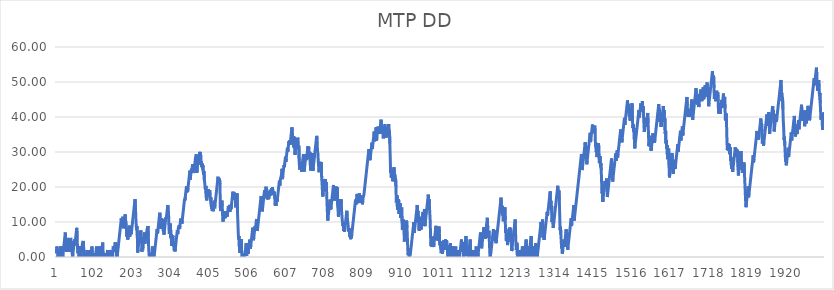
| Category | MTP DD |
|---|---|
| 0 | 1 |
| 1 | 2 |
| 2 | 3 |
| 3 | 1.1 |
| 4 | 2.1 |
| 5 | 0 |
| 6 | 0 |
| 7 | 1 |
| 8 | 0 |
| 9 | 1 |
| 10 | 2 |
| 11 | 3 |
| 12 | 0.94 |
| 13 | 0 |
| 14 | 1 |
| 15 | 2 |
| 16 | 3 |
| 17 | 0 |
| 18 | 1 |
| 19 | 2 |
| 20 | 3 |
| 21 | 4 |
| 22 | 5 |
| 23 | 6 |
| 24 | 7 |
| 25 | 4.6 |
| 26 | 1.46 |
| 27 | 2.46 |
| 28 | 3.46 |
| 29 | 4.46 |
| 30 | 5.46 |
| 31 | 3.83 |
| 32 | 2.4 |
| 33 | 3.4 |
| 34 | 1.46 |
| 35 | 2.46 |
| 36 | 3.46 |
| 37 | 4.46 |
| 38 | 5.46 |
| 39 | 2.52 |
| 40 | 3.52 |
| 41 | 4.52 |
| 42 | 1.09 |
| 43 | 0 |
| 44 | 1 |
| 45 | 2 |
| 46 | 3 |
| 47 | 4 |
| 48 | 5 |
| 49 | 3.33 |
| 50 | 4.33 |
| 51 | 5.33 |
| 52 | 6.33 |
| 53 | 7.33 |
| 54 | 8.33 |
| 55 | 5.44 |
| 56 | 2.7 |
| 57 | 1.05 |
| 58 | 2.05 |
| 59 | 3.05 |
| 60 | 0.11 |
| 61 | 1.11 |
| 62 | 2.11 |
| 63 | 3.11 |
| 64 | 1.72 |
| 65 | 0 |
| 66 | 1 |
| 67 | 2 |
| 68 | 3 |
| 69 | 4 |
| 70 | 3.59 |
| 71 | 4.59 |
| 72 | 2.92 |
| 73 | 0.27 |
| 74 | 0 |
| 75 | 0 |
| 76 | 0 |
| 77 | 1 |
| 78 | 0 |
| 79 | 0 |
| 80 | 1 |
| 81 | 2 |
| 82 | 0 |
| 83 | 0 |
| 84 | 1 |
| 85 | 2 |
| 86 | 0.94 |
| 87 | 0 |
| 88 | 0 |
| 89 | 1 |
| 90 | 0 |
| 91 | 0 |
| 92 | 1 |
| 93 | 2 |
| 94 | 3 |
| 95 | 0.06 |
| 96 | 0 |
| 97 | 0 |
| 98 | 0 |
| 99 | 0 |
| 100 | 1 |
| 101 | 0 |
| 102 | 1 |
| 103 | 0 |
| 104 | 1 |
| 105 | 2 |
| 106 | 3 |
| 107 | 1.33 |
| 108 | 0 |
| 109 | 0 |
| 110 | 1 |
| 111 | 2 |
| 112 | 3 |
| 113 | 0 |
| 114 | 1 |
| 115 | 0 |
| 116 | 1 |
| 117 | 2 |
| 118 | 3 |
| 119 | 1.12 |
| 120 | 2.12 |
| 121 | 3.12 |
| 122 | 4.12 |
| 123 | 0 |
| 124 | 1 |
| 125 | 0 |
| 126 | 0 |
| 127 | 0 |
| 128 | 0 |
| 129 | 0 |
| 130 | 1 |
| 131 | 0 |
| 132 | 1 |
| 133 | 0 |
| 134 | 1 |
| 135 | 2 |
| 136 | 0.31 |
| 137 | 0 |
| 138 | 0 |
| 139 | 1 |
| 140 | 0 |
| 141 | 1 |
| 142 | 2 |
| 143 | 0 |
| 144 | 0 |
| 145 | 1 |
| 146 | 2 |
| 147 | 0 |
| 148 | 1 |
| 149 | 2 |
| 150 | 3 |
| 151 | 1.53 |
| 152 | 2.53 |
| 153 | 2.23 |
| 154 | 3.23 |
| 155 | 4.23 |
| 156 | 3.11 |
| 157 | 2.03 |
| 158 | 0.02 |
| 159 | 1.02 |
| 160 | 0 |
| 161 | 1 |
| 162 | 2 |
| 163 | 3 |
| 164 | 4 |
| 165 | 5 |
| 166 | 6 |
| 167 | 7 |
| 168 | 8 |
| 169 | 9 |
| 170 | 10 |
| 171 | 11 |
| 172 | 8.5 |
| 173 | 9.5 |
| 174 | 10.5 |
| 175 | 11.5 |
| 176 | 9.34 |
| 177 | 8.18 |
| 178 | 9.18 |
| 179 | 10.18 |
| 180 | 11.18 |
| 181 | 12.18 |
| 182 | 10.55 |
| 183 | 10.25 |
| 184 | 9.28 |
| 185 | 5.85 |
| 186 | 6.85 |
| 187 | 5.77 |
| 188 | 4.97 |
| 189 | 5.97 |
| 190 | 6.97 |
| 191 | 7.97 |
| 192 | 8.97 |
| 193 | 5.83 |
| 194 | 6.83 |
| 195 | 7.83 |
| 196 | 8.83 |
| 197 | 6.53 |
| 198 | 7.53 |
| 199 | 8.53 |
| 200 | 9.53 |
| 201 | 10.53 |
| 202 | 11.53 |
| 203 | 12.53 |
| 204 | 13.53 |
| 205 | 14.53 |
| 206 | 15.53 |
| 207 | 16.53 |
| 208 | 14.57 |
| 209 | 11.34 |
| 210 | 9.23 |
| 211 | 7.8 |
| 212 | 8.8 |
| 213 | 6.15 |
| 214 | 1.25 |
| 215 | 2.25 |
| 216 | 3.25 |
| 217 | 4.25 |
| 218 | 5.25 |
| 219 | 4.6 |
| 220 | 5.6 |
| 221 | 6.6 |
| 222 | 7.6 |
| 223 | 6.99 |
| 224 | 4.93 |
| 225 | 1.5 |
| 226 | 2.5 |
| 227 | 2 |
| 228 | 3 |
| 229 | 4 |
| 230 | 5 |
| 231 | 6 |
| 232 | 7 |
| 233 | 3.86 |
| 234 | 4.86 |
| 235 | 5.86 |
| 236 | 6.86 |
| 237 | 6.2 |
| 238 | 7.2 |
| 239 | 8.2 |
| 240 | 7.85 |
| 241 | 8.85 |
| 242 | 5.32 |
| 243 | 2.09 |
| 244 | 0.62 |
| 245 | 0 |
| 246 | 1 |
| 247 | 0 |
| 248 | 0 |
| 249 | 1 |
| 250 | 0 |
| 251 | 1 |
| 252 | 2 |
| 253 | 3 |
| 254 | 0 |
| 255 | 1 |
| 256 | 0 |
| 257 | 0 |
| 258 | 1 |
| 259 | 2 |
| 260 | 3 |
| 261 | 4 |
| 262 | 5 |
| 263 | 6 |
| 264 | 7 |
| 265 | 8 |
| 266 | 6.65 |
| 267 | 7.65 |
| 268 | 8.65 |
| 269 | 9.65 |
| 270 | 10.65 |
| 271 | 11.65 |
| 272 | 12.65 |
| 273 | 11.49 |
| 274 | 8.06 |
| 275 | 9.06 |
| 276 | 10.06 |
| 277 | 11.06 |
| 278 | 8.81 |
| 279 | 9.81 |
| 280 | 10.81 |
| 281 | 7.58 |
| 282 | 7.22 |
| 283 | 6.38 |
| 284 | 7.38 |
| 285 | 8.38 |
| 286 | 9.38 |
| 287 | 10.38 |
| 288 | 11.38 |
| 289 | 10.86 |
| 290 | 11.86 |
| 291 | 12.86 |
| 292 | 13.86 |
| 293 | 14.86 |
| 294 | 13.66 |
| 295 | 12.74 |
| 296 | 8.53 |
| 297 | 6.57 |
| 298 | 7.57 |
| 299 | 8.57 |
| 300 | 9.57 |
| 301 | 5.55 |
| 302 | 6.55 |
| 303 | 3.12 |
| 304 | 4.12 |
| 305 | 5.12 |
| 306 | 6.12 |
| 307 | 5.62 |
| 308 | 3.88 |
| 309 | 2.88 |
| 310 | 1.9 |
| 311 | 2.9 |
| 312 | 1.61 |
| 313 | 2.61 |
| 314 | 3.61 |
| 315 | 4.61 |
| 316 | 5.61 |
| 317 | 6.61 |
| 318 | 7.61 |
| 319 | 6.55 |
| 320 | 7.55 |
| 321 | 8.55 |
| 322 | 8.07 |
| 323 | 9.07 |
| 324 | 7.99 |
| 325 | 8.99 |
| 326 | 9.99 |
| 327 | 10.99 |
| 328 | 9.72 |
| 329 | 10.72 |
| 330 | 9.56 |
| 331 | 10.56 |
| 332 | 11.56 |
| 333 | 12.56 |
| 334 | 13.56 |
| 335 | 14.56 |
| 336 | 15.56 |
| 337 | 16.56 |
| 338 | 16.18 |
| 339 | 17.18 |
| 340 | 18.18 |
| 341 | 19.18 |
| 342 | 20.18 |
| 343 | 18.46 |
| 344 | 19.46 |
| 345 | 18.67 |
| 346 | 19.67 |
| 347 | 20.67 |
| 348 | 21.67 |
| 349 | 22.67 |
| 350 | 23.67 |
| 351 | 24.67 |
| 352 | 22.12 |
| 353 | 23.12 |
| 354 | 24.12 |
| 355 | 25.12 |
| 356 | 24.49 |
| 357 | 25.49 |
| 358 | 26.49 |
| 359 | 23.99 |
| 360 | 24.99 |
| 361 | 25.99 |
| 362 | 24.64 |
| 363 | 25.64 |
| 364 | 26.64 |
| 365 | 27.64 |
| 366 | 28.64 |
| 367 | 28.3 |
| 368 | 29.3 |
| 369 | 24.01 |
| 370 | 25.01 |
| 371 | 26.01 |
| 372 | 27.01 |
| 373 | 28.01 |
| 374 | 27.05 |
| 375 | 28.05 |
| 376 | 29.05 |
| 377 | 30.05 |
| 378 | 28.95 |
| 379 | 29.95 |
| 380 | 26.32 |
| 381 | 27.32 |
| 382 | 25.77 |
| 383 | 26.77 |
| 384 | 25.26 |
| 385 | 26.26 |
| 386 | 24.44 |
| 387 | 23.49 |
| 388 | 24.49 |
| 389 | 22.09 |
| 390 | 21.35 |
| 391 | 19.61 |
| 392 | 19.31 |
| 393 | 20.31 |
| 394 | 17.08 |
| 395 | 16.17 |
| 396 | 17.17 |
| 397 | 18.17 |
| 398 | 19.17 |
| 399 | 18.42 |
| 400 | 19.42 |
| 401 | 17.12 |
| 402 | 18.12 |
| 403 | 19.12 |
| 404 | 17.65 |
| 405 | 16.06 |
| 406 | 17.06 |
| 407 | 14.76 |
| 408 | 13.78 |
| 409 | 14.78 |
| 410 | 13.17 |
| 411 | 14.17 |
| 412 | 13.09 |
| 413 | 14.09 |
| 414 | 15.09 |
| 415 | 16.09 |
| 416 | 13.93 |
| 417 | 14.93 |
| 418 | 15.93 |
| 419 | 16.93 |
| 420 | 17.93 |
| 421 | 18.93 |
| 422 | 19.93 |
| 423 | 20.93 |
| 424 | 21.93 |
| 425 | 22.93 |
| 426 | 21.58 |
| 427 | 22.58 |
| 428 | 21.15 |
| 429 | 22.15 |
| 430 | 20.74 |
| 431 | 14.08 |
| 432 | 13.11 |
| 433 | 14.11 |
| 434 | 15.11 |
| 435 | 16.11 |
| 436 | 14.58 |
| 437 | 11.74 |
| 438 | 10.11 |
| 439 | 11.11 |
| 440 | 12.11 |
| 441 | 11.07 |
| 442 | 12.07 |
| 443 | 13.07 |
| 444 | 11.11 |
| 445 | 12.11 |
| 446 | 13.11 |
| 447 | 11.5 |
| 448 | 12.5 |
| 449 | 11.57 |
| 450 | 12.57 |
| 451 | 13.57 |
| 452 | 14.57 |
| 453 | 12.88 |
| 454 | 13.88 |
| 455 | 14.88 |
| 456 | 12.92 |
| 457 | 13.92 |
| 458 | 14.92 |
| 459 | 13.67 |
| 460 | 14.67 |
| 461 | 15.67 |
| 462 | 16.67 |
| 463 | 17.67 |
| 464 | 18.67 |
| 465 | 16.51 |
| 466 | 17.51 |
| 467 | 18.51 |
| 468 | 16.31 |
| 469 | 17.31 |
| 470 | 18.31 |
| 471 | 14.19 |
| 472 | 15.19 |
| 473 | 16.19 |
| 474 | 17.19 |
| 475 | 18.19 |
| 476 | 12.9 |
| 477 | 10.01 |
| 478 | 6.78 |
| 479 | 5.02 |
| 480 | 6.02 |
| 481 | 2.88 |
| 482 | 1.16 |
| 483 | 2.16 |
| 484 | 3.16 |
| 485 | 4.16 |
| 486 | 5.16 |
| 487 | 1.34 |
| 488 | 0 |
| 489 | 0 |
| 490 | 1 |
| 491 | 0 |
| 492 | 1 |
| 493 | 0 |
| 494 | 0 |
| 495 | 0 |
| 496 | 1 |
| 497 | 2 |
| 498 | 3 |
| 499 | 4 |
| 500 | 0.37 |
| 501 | 1.37 |
| 502 | 2.37 |
| 503 | 3.37 |
| 504 | 0.97 |
| 505 | 1.97 |
| 506 | 2.97 |
| 507 | 3.97 |
| 508 | 4.97 |
| 509 | 3.05 |
| 510 | 2.38 |
| 511 | 3.38 |
| 512 | 4.38 |
| 513 | 5.38 |
| 514 | 6.38 |
| 515 | 7.38 |
| 516 | 8.38 |
| 517 | 7.28 |
| 518 | 4.78 |
| 519 | 5.78 |
| 520 | 6.78 |
| 521 | 7.78 |
| 522 | 8.78 |
| 523 | 7.87 |
| 524 | 8.87 |
| 525 | 9.87 |
| 526 | 10.87 |
| 527 | 10.12 |
| 528 | 7.43 |
| 529 | 8.43 |
| 530 | 9.43 |
| 531 | 10.43 |
| 532 | 11.43 |
| 533 | 12.43 |
| 534 | 13.43 |
| 535 | 14.43 |
| 536 | 15.43 |
| 537 | 16.43 |
| 538 | 17.43 |
| 539 | 16.54 |
| 540 | 13.94 |
| 541 | 13.03 |
| 542 | 14.03 |
| 543 | 15.03 |
| 544 | 16.03 |
| 545 | 17.03 |
| 546 | 18.03 |
| 547 | 19.03 |
| 548 | 17.09 |
| 549 | 18.09 |
| 550 | 19.09 |
| 551 | 20.09 |
| 552 | 18.27 |
| 553 | 19.27 |
| 554 | 16.53 |
| 555 | 17.53 |
| 556 | 16.49 |
| 557 | 17.49 |
| 558 | 16.68 |
| 559 | 17.68 |
| 560 | 18.68 |
| 561 | 17.45 |
| 562 | 18.45 |
| 563 | 18.25 |
| 564 | 19.25 |
| 565 | 18.65 |
| 566 | 19.65 |
| 567 | 18.99 |
| 568 | 19.99 |
| 569 | 17.69 |
| 570 | 18.69 |
| 571 | 18.49 |
| 572 | 17.65 |
| 573 | 18.65 |
| 574 | 16.83 |
| 575 | 14.72 |
| 576 | 15.72 |
| 577 | 14.62 |
| 578 | 15.62 |
| 579 | 16.62 |
| 580 | 15.82 |
| 581 | 16.82 |
| 582 | 17.82 |
| 583 | 18.82 |
| 584 | 19.82 |
| 585 | 20.82 |
| 586 | 21.82 |
| 587 | 20.43 |
| 588 | 21.43 |
| 589 | 22.43 |
| 590 | 22.19 |
| 591 | 23.19 |
| 592 | 24.19 |
| 593 | 25.19 |
| 594 | 22.25 |
| 595 | 23.25 |
| 596 | 24.25 |
| 597 | 25.25 |
| 598 | 26.25 |
| 599 | 25.66 |
| 600 | 26.66 |
| 601 | 27.66 |
| 602 | 28.66 |
| 603 | 27.21 |
| 604 | 28.21 |
| 605 | 29.21 |
| 606 | 30.21 |
| 607 | 31.21 |
| 608 | 30.09 |
| 609 | 31.09 |
| 610 | 32.09 |
| 611 | 33.09 |
| 612 | 32.34 |
| 613 | 33.34 |
| 614 | 32.05 |
| 615 | 33.05 |
| 616 | 34.05 |
| 617 | 35.05 |
| 618 | 36.05 |
| 619 | 37.05 |
| 620 | 35.82 |
| 621 | 33.57 |
| 622 | 34.57 |
| 623 | 31.34 |
| 624 | 32.34 |
| 625 | 33.34 |
| 626 | 34.34 |
| 627 | 29.24 |
| 628 | 30.24 |
| 629 | 31.24 |
| 630 | 32.24 |
| 631 | 33.24 |
| 632 | 32.08 |
| 633 | 33.08 |
| 634 | 34.08 |
| 635 | 33.69 |
| 636 | 30.8 |
| 637 | 31.8 |
| 638 | 27.49 |
| 639 | 24.99 |
| 640 | 25.99 |
| 641 | 25.22 |
| 642 | 26.22 |
| 643 | 27.22 |
| 644 | 24.33 |
| 645 | 25.33 |
| 646 | 26.33 |
| 647 | 27.33 |
| 648 | 28.33 |
| 649 | 29.33 |
| 650 | 25.9 |
| 651 | 24.41 |
| 652 | 25.41 |
| 653 | 26.41 |
| 654 | 27.41 |
| 655 | 28.41 |
| 656 | 29.41 |
| 657 | 27.69 |
| 658 | 28.69 |
| 659 | 29.69 |
| 660 | 30.69 |
| 661 | 31.69 |
| 662 | 30.38 |
| 663 | 31.38 |
| 664 | 28.05 |
| 665 | 29.05 |
| 666 | 30.05 |
| 667 | 26.82 |
| 668 | 24.71 |
| 669 | 25.71 |
| 670 | 26.71 |
| 671 | 27.71 |
| 672 | 28.71 |
| 673 | 29.71 |
| 674 | 24.61 |
| 675 | 25.61 |
| 676 | 26.61 |
| 677 | 27.61 |
| 678 | 28.61 |
| 679 | 29.61 |
| 680 | 30.61 |
| 681 | 31.61 |
| 682 | 32.61 |
| 683 | 33.61 |
| 684 | 34.61 |
| 685 | 33.43 |
| 686 | 30.29 |
| 687 | 29.78 |
| 688 | 27.48 |
| 689 | 25.99 |
| 690 | 24.21 |
| 691 | 25.21 |
| 692 | 26.21 |
| 693 | 27.21 |
| 694 | 25.1 |
| 695 | 26.1 |
| 696 | 27.1 |
| 697 | 22.69 |
| 698 | 21.1 |
| 699 | 18.9 |
| 700 | 17.27 |
| 701 | 18.27 |
| 702 | 19.27 |
| 703 | 20.27 |
| 704 | 21.27 |
| 705 | 22.27 |
| 706 | 21.29 |
| 707 | 22.29 |
| 708 | 20.33 |
| 709 | 21.33 |
| 710 | 18.64 |
| 711 | 15.5 |
| 712 | 12.9 |
| 713 | 10.4 |
| 714 | 11.4 |
| 715 | 12.4 |
| 716 | 13.4 |
| 717 | 14.4 |
| 718 | 15.4 |
| 719 | 16.4 |
| 720 | 14.89 |
| 721 | 13.58 |
| 722 | 14.58 |
| 723 | 15.58 |
| 724 | 16.58 |
| 725 | 17.58 |
| 726 | 18.58 |
| 727 | 19.58 |
| 728 | 20.58 |
| 729 | 17.54 |
| 730 | 18.54 |
| 731 | 16.14 |
| 732 | 17.14 |
| 733 | 18.14 |
| 734 | 19.14 |
| 735 | 20.14 |
| 736 | 17.94 |
| 737 | 18.94 |
| 738 | 19.94 |
| 739 | 14.65 |
| 740 | 13.42 |
| 741 | 11.5 |
| 742 | 12.5 |
| 743 | 13.5 |
| 744 | 14.5 |
| 745 | 15.5 |
| 746 | 16.5 |
| 747 | 15.46 |
| 748 | 16.46 |
| 749 | 13.57 |
| 750 | 12.08 |
| 751 | 10.55 |
| 752 | 10.28 |
| 753 | 8.81 |
| 754 | 9.81 |
| 755 | 7.41 |
| 756 | 8.41 |
| 757 | 7.21 |
| 758 | 8.21 |
| 759 | 9.21 |
| 760 | 10.21 |
| 761 | 11.21 |
| 762 | 12.21 |
| 763 | 13.21 |
| 764 | 11.82 |
| 765 | 10.47 |
| 766 | 9.6 |
| 767 | 8.29 |
| 768 | 7.27 |
| 769 | 8.27 |
| 770 | 7.21 |
| 771 | 5.66 |
| 772 | 6.66 |
| 773 | 5.09 |
| 774 | 6.09 |
| 775 | 5.38 |
| 776 | 6.38 |
| 777 | 7.38 |
| 778 | 8.38 |
| 779 | 9.38 |
| 780 | 10.38 |
| 781 | 11.38 |
| 782 | 12.38 |
| 783 | 13.38 |
| 784 | 14.38 |
| 785 | 15.38 |
| 786 | 16.38 |
| 787 | 15.03 |
| 788 | 16.03 |
| 789 | 17.03 |
| 790 | 18.03 |
| 791 | 16.89 |
| 792 | 15.38 |
| 793 | 16.38 |
| 794 | 16.18 |
| 795 | 17.18 |
| 796 | 18.18 |
| 797 | 16.69 |
| 798 | 17.69 |
| 799 | 15.44 |
| 800 | 16.44 |
| 801 | 17.44 |
| 802 | 16.19 |
| 803 | 17.19 |
| 804 | 15.08 |
| 805 | 16.08 |
| 806 | 17.08 |
| 807 | 16.83 |
| 808 | 17.83 |
| 809 | 18.83 |
| 810 | 19.83 |
| 811 | 20.83 |
| 812 | 21.83 |
| 813 | 22.83 |
| 814 | 23.83 |
| 815 | 24.83 |
| 816 | 25.83 |
| 817 | 26.83 |
| 818 | 27.83 |
| 819 | 28.83 |
| 820 | 29.83 |
| 821 | 30.83 |
| 822 | 29.6 |
| 823 | 28.67 |
| 824 | 27.65 |
| 825 | 28.65 |
| 826 | 29.65 |
| 827 | 30.65 |
| 828 | 31.65 |
| 829 | 32.65 |
| 830 | 30.85 |
| 831 | 31.85 |
| 832 | 32.85 |
| 833 | 33.85 |
| 834 | 34.85 |
| 835 | 35.85 |
| 836 | 33.06 |
| 837 | 34.06 |
| 838 | 35.06 |
| 839 | 36.06 |
| 840 | 37.06 |
| 841 | 33.24 |
| 842 | 34.24 |
| 843 | 35.24 |
| 844 | 36.24 |
| 845 | 37.24 |
| 846 | 36.32 |
| 847 | 36.16 |
| 848 | 37.16 |
| 849 | 35.24 |
| 850 | 36.24 |
| 851 | 37.24 |
| 852 | 38.24 |
| 853 | 39.24 |
| 854 | 36.94 |
| 855 | 35.23 |
| 856 | 36.23 |
| 857 | 35.31 |
| 858 | 36.31 |
| 859 | 33.91 |
| 860 | 34.91 |
| 861 | 35.91 |
| 862 | 36.91 |
| 863 | 37.91 |
| 864 | 35.8 |
| 865 | 36.8 |
| 866 | 34.11 |
| 867 | 35.11 |
| 868 | 36.11 |
| 869 | 37.11 |
| 870 | 35 |
| 871 | 36 |
| 872 | 37 |
| 873 | 38 |
| 874 | 35.06 |
| 875 | 36.06 |
| 876 | 32.43 |
| 877 | 28.61 |
| 878 | 24.1 |
| 879 | 25.1 |
| 880 | 22.7 |
| 881 | 23.7 |
| 882 | 24.7 |
| 883 | 21.66 |
| 884 | 22.66 |
| 885 | 23.66 |
| 886 | 24.66 |
| 887 | 25.66 |
| 888 | 22.62 |
| 889 | 23.62 |
| 890 | 21.61 |
| 891 | 22.61 |
| 892 | 20.11 |
| 893 | 15.6 |
| 894 | 16.6 |
| 895 | 17.6 |
| 896 | 13.58 |
| 897 | 14.58 |
| 898 | 15.58 |
| 899 | 16.58 |
| 900 | 12.37 |
| 901 | 13.37 |
| 902 | 14.37 |
| 903 | 15.37 |
| 904 | 11.16 |
| 905 | 12.16 |
| 906 | 13.16 |
| 907 | 14.16 |
| 908 | 10.24 |
| 909 | 7.69 |
| 910 | 8.69 |
| 911 | 9.69 |
| 912 | 10.69 |
| 913 | 8.04 |
| 914 | 4.41 |
| 915 | 5.41 |
| 916 | 6.41 |
| 917 | 7.41 |
| 918 | 8.41 |
| 919 | 9.41 |
| 920 | 10.41 |
| 921 | 8.45 |
| 922 | 5.56 |
| 923 | 2.52 |
| 924 | 0.506 |
| 925 | 1.506 |
| 926 | 2.506 |
| 927 | 0 |
| 928 | 0 |
| 929 | 0 |
| 930 | 1 |
| 931 | 2 |
| 932 | 3 |
| 933 | 4 |
| 934 | 5 |
| 935 | 6 |
| 936 | 7 |
| 937 | 8 |
| 938 | 9 |
| 939 | 10 |
| 940 | 6.86 |
| 941 | 7.86 |
| 942 | 8.86 |
| 943 | 9.86 |
| 944 | 10.86 |
| 945 | 11.86 |
| 946 | 12.86 |
| 947 | 13.86 |
| 948 | 14.86 |
| 949 | 12.17 |
| 950 | 13.17 |
| 951 | 9.84 |
| 952 | 10.84 |
| 953 | 7.51 |
| 954 | 8.51 |
| 955 | 9.51 |
| 956 | 10.51 |
| 957 | 11.51 |
| 958 | 7.88 |
| 959 | 8.88 |
| 960 | 9.88 |
| 961 | 10.88 |
| 962 | 11.88 |
| 963 | 12.88 |
| 964 | 10.72 |
| 965 | 11.72 |
| 966 | 12.72 |
| 967 | 13.72 |
| 968 | 8.82 |
| 969 | 9.82 |
| 970 | 10.82 |
| 971 | 11.82 |
| 972 | 12.82 |
| 973 | 13.82 |
| 974 | 14.82 |
| 975 | 15.82 |
| 976 | 16.82 |
| 977 | 17.82 |
| 978 | 15.52 |
| 979 | 16.52 |
| 980 | 14.32 |
| 981 | 12.26 |
| 982 | 10.15 |
| 983 | 5.64 |
| 984 | 3.14 |
| 985 | 4.14 |
| 986 | 5.14 |
| 987 | 2.84 |
| 988 | 3.84 |
| 989 | 4.84 |
| 990 | 5.84 |
| 991 | 2.9 |
| 992 | 3.9 |
| 993 | 4.9 |
| 994 | 5.9 |
| 995 | 6.9 |
| 996 | 7.9 |
| 997 | 8.9 |
| 998 | 5.76 |
| 999 | 6.76 |
| 1000 | 7.76 |
| 1001 | 4.72 |
| 1002 | 5.72 |
| 1003 | 6.72 |
| 1004 | 7.72 |
| 1005 | 8.72 |
| 1006 | 6.76 |
| 1007 | 3.53 |
| 1008 | 4.53 |
| 1009 | 2.52 |
| 1010 | 3.52 |
| 1011 | 1.12 |
| 1012 | 2.12 |
| 1013 | 3.12 |
| 1014 | 0.87 |
| 1015 | 1.87 |
| 1016 | 2.87 |
| 1017 | 3.87 |
| 1018 | 4.87 |
| 1019 | 2.03 |
| 1020 | 3.03 |
| 1021 | 4.03 |
| 1022 | 5.03 |
| 1023 | 2.87 |
| 1024 | 3.87 |
| 1025 | 4.87 |
| 1026 | 2.42 |
| 1027 | 3.42 |
| 1028 | 0 |
| 1029 | 0 |
| 1030 | 0 |
| 1031 | 0 |
| 1032 | 1 |
| 1033 | 2 |
| 1034 | 3 |
| 1035 | 4 |
| 1036 | 0 |
| 1037 | 1 |
| 1038 | 2 |
| 1039 | 3 |
| 1040 | 0 |
| 1041 | 1 |
| 1042 | 2 |
| 1043 | 3 |
| 1044 | 0.21 |
| 1045 | 1.21 |
| 1046 | 0 |
| 1047 | 1 |
| 1048 | 2 |
| 1049 | 3 |
| 1050 | 0 |
| 1051 | 1 |
| 1052 | 2 |
| 1053 | 0 |
| 1054 | 1 |
| 1055 | 2 |
| 1056 | 0.04 |
| 1057 | 0 |
| 1058 | 0 |
| 1059 | 0 |
| 1060 | 1 |
| 1061 | 2 |
| 1062 | 3 |
| 1063 | 4 |
| 1064 | 5 |
| 1065 | 2.31 |
| 1066 | 3.31 |
| 1067 | 4.31 |
| 1068 | 1.47 |
| 1069 | 2.47 |
| 1070 | 0 |
| 1071 | 1 |
| 1072 | 2 |
| 1073 | 3 |
| 1074 | 4 |
| 1075 | 5 |
| 1076 | 6 |
| 1077 | 2.96 |
| 1078 | 0.27 |
| 1079 | 0 |
| 1080 | 0 |
| 1081 | 1 |
| 1082 | 0 |
| 1083 | 1 |
| 1084 | 2 |
| 1085 | 3 |
| 1086 | 4 |
| 1087 | 5 |
| 1088 | 2.26 |
| 1089 | 0 |
| 1090 | 1 |
| 1091 | 0 |
| 1092 | 0 |
| 1093 | 1 |
| 1094 | 2 |
| 1095 | 0 |
| 1096 | 1 |
| 1097 | 2 |
| 1098 | 0 |
| 1099 | 1 |
| 1100 | 0 |
| 1101 | 1 |
| 1102 | 2 |
| 1103 | 3 |
| 1104 | 0.06 |
| 1105 | 1.06 |
| 1106 | 2.06 |
| 1107 | 0 |
| 1108 | 1 |
| 1109 | 2 |
| 1110 | 3 |
| 1111 | 4 |
| 1112 | 5 |
| 1113 | 6 |
| 1114 | 7 |
| 1115 | 4.55 |
| 1116 | 5.55 |
| 1117 | 2.51 |
| 1118 | 3.51 |
| 1119 | 4.51 |
| 1120 | 5.51 |
| 1121 | 6.51 |
| 1122 | 7.51 |
| 1123 | 8.51 |
| 1124 | 6.31 |
| 1125 | 7.31 |
| 1126 | 5.2 |
| 1127 | 6.2 |
| 1128 | 7.2 |
| 1129 | 8.2 |
| 1130 | 9.2 |
| 1131 | 10.2 |
| 1132 | 11.2 |
| 1133 | 8.16 |
| 1134 | 5.51 |
| 1135 | 6.51 |
| 1136 | 7.51 |
| 1137 | 5.4 |
| 1138 | 2.46 |
| 1139 | 0 |
| 1140 | 0 |
| 1141 | 1 |
| 1142 | 2 |
| 1143 | 3 |
| 1144 | 4 |
| 1145 | 5 |
| 1146 | 6 |
| 1147 | 7 |
| 1148 | 8 |
| 1149 | 5.6 |
| 1150 | 6.6 |
| 1151 | 7.6 |
| 1152 | 4.56 |
| 1153 | 5.56 |
| 1154 | 6.56 |
| 1155 | 3.96 |
| 1156 | 4.96 |
| 1157 | 5.96 |
| 1158 | 6.96 |
| 1159 | 7.96 |
| 1160 | 8.96 |
| 1161 | 9.96 |
| 1162 | 10.96 |
| 1163 | 11.96 |
| 1164 | 12.96 |
| 1165 | 13.96 |
| 1166 | 14.96 |
| 1167 | 15.96 |
| 1168 | 16.96 |
| 1169 | 12.65 |
| 1170 | 13.65 |
| 1171 | 14.65 |
| 1172 | 11.96 |
| 1173 | 12.96 |
| 1174 | 10.22 |
| 1175 | 11.22 |
| 1176 | 12.22 |
| 1177 | 13.22 |
| 1178 | 14.22 |
| 1179 | 10.59 |
| 1180 | 6.87 |
| 1181 | 7.87 |
| 1182 | 4.54 |
| 1183 | 5.54 |
| 1184 | 6.54 |
| 1185 | 3.4 |
| 1186 | 4.4 |
| 1187 | 5.4 |
| 1188 | 6.4 |
| 1189 | 7.4 |
| 1190 | 8.4 |
| 1191 | 6.34 |
| 1192 | 7.34 |
| 1193 | 8.34 |
| 1194 | 4.32 |
| 1195 | 5.32 |
| 1196 | 1.69 |
| 1197 | 2.69 |
| 1198 | 3.69 |
| 1199 | 4.69 |
| 1200 | 5.69 |
| 1201 | 6.69 |
| 1202 | 7.69 |
| 1203 | 8.69 |
| 1204 | 9.69 |
| 1205 | 10.69 |
| 1206 | 7.16 |
| 1207 | 4.12 |
| 1208 | 2.06 |
| 1209 | 3.06 |
| 1210 | 4.06 |
| 1211 | 0 |
| 1212 | 1 |
| 1213 | 2 |
| 1214 | 0 |
| 1215 | 1 |
| 1216 | 2 |
| 1217 | 0 |
| 1218 | 0 |
| 1219 | 0 |
| 1220 | 1 |
| 1221 | 0 |
| 1222 | 1 |
| 1223 | 2 |
| 1224 | 3 |
| 1225 | 0 |
| 1226 | 1 |
| 1227 | 2 |
| 1228 | 3 |
| 1229 | 0 |
| 1230 | 1 |
| 1231 | 2 |
| 1232 | 3 |
| 1233 | 4 |
| 1234 | 5 |
| 1235 | 1.96 |
| 1236 | 0 |
| 1237 | 1 |
| 1238 | 2 |
| 1239 | 3 |
| 1240 | 1.04 |
| 1241 | 0 |
| 1242 | 1 |
| 1243 | 2 |
| 1244 | 3 |
| 1245 | 4 |
| 1246 | 5 |
| 1247 | 6 |
| 1248 | 1.79 |
| 1249 | 0 |
| 1250 | 1 |
| 1251 | 2 |
| 1252 | 0.04 |
| 1253 | 1.04 |
| 1254 | 2.04 |
| 1255 | 3.04 |
| 1256 | 0.93 |
| 1257 | 1.93 |
| 1258 | 2.93 |
| 1259 | 3.93 |
| 1260 | 0 |
| 1261 | 0 |
| 1262 | 1 |
| 1263 | 0 |
| 1264 | 1 |
| 1265 | 2 |
| 1266 | 3 |
| 1267 | 4 |
| 1268 | 5 |
| 1269 | 6 |
| 1270 | 7 |
| 1271 | 8 |
| 1272 | 9 |
| 1273 | 10 |
| 1274 | 7.7 |
| 1275 | 8.7 |
| 1276 | 9.7 |
| 1277 | 10.7 |
| 1278 | 5.6 |
| 1279 | 6.6 |
| 1280 | 7.6 |
| 1281 | 4.91 |
| 1282 | 5.91 |
| 1283 | 6.91 |
| 1284 | 7.91 |
| 1285 | 8.91 |
| 1286 | 9.91 |
| 1287 | 10.91 |
| 1288 | 11.91 |
| 1289 | 12.91 |
| 1290 | 11.755 |
| 1291 | 12.755 |
| 1292 | 13.755 |
| 1293 | 14.755 |
| 1294 | 15.755 |
| 1295 | 16.755 |
| 1296 | 17.755 |
| 1297 | 18.755 |
| 1298 | 15.035 |
| 1299 | 16.035 |
| 1300 | 13.485 |
| 1301 | 14.485 |
| 1302 | 9.975 |
| 1303 | 10.975 |
| 1304 | 11.975 |
| 1305 | 8.345 |
| 1306 | 9.345 |
| 1307 | 10.345 |
| 1308 | 11.345 |
| 1309 | 12.345 |
| 1310 | 13.345 |
| 1311 | 14.345 |
| 1312 | 15.345 |
| 1313 | 16.345 |
| 1314 | 17.345 |
| 1315 | 18.345 |
| 1316 | 19.345 |
| 1317 | 20.345 |
| 1318 | 17.015 |
| 1319 | 18.015 |
| 1320 | 19.015 |
| 1321 | 16.075 |
| 1322 | 12.055 |
| 1323 | 7.645 |
| 1324 | 8.645 |
| 1325 | 6.445 |
| 1326 | 4.485 |
| 1327 | 2.475 |
| 1328 | 3.475 |
| 1329 | 0.975 |
| 1330 | 1.975 |
| 1331 | 2.975 |
| 1332 | 3.975 |
| 1333 | 4.975 |
| 1334 | 2.915 |
| 1335 | 3.915 |
| 1336 | 4.915 |
| 1337 | 5.915 |
| 1338 | 6.915 |
| 1339 | 7.915 |
| 1340 | 5.805 |
| 1341 | 6.805 |
| 1342 | 4.455 |
| 1343 | 2.055 |
| 1344 | 3.055 |
| 1345 | 4.055 |
| 1346 | 5.055 |
| 1347 | 6.055 |
| 1348 | 7.055 |
| 1349 | 8.055 |
| 1350 | 9.055 |
| 1351 | 10.055 |
| 1352 | 11.055 |
| 1353 | 8.855 |
| 1354 | 9.855 |
| 1355 | 10.855 |
| 1356 | 11.855 |
| 1357 | 12.855 |
| 1358 | 13.855 |
| 1359 | 14.855 |
| 1360 | 10.445 |
| 1361 | 11.445 |
| 1362 | 12.445 |
| 1363 | 13.445 |
| 1364 | 14.445 |
| 1365 | 15.445 |
| 1366 | 16.445 |
| 1367 | 17.445 |
| 1368 | 18.445 |
| 1369 | 19.445 |
| 1370 | 20.445 |
| 1371 | 21.445 |
| 1372 | 22.445 |
| 1373 | 23.445 |
| 1374 | 24.445 |
| 1375 | 25.445 |
| 1376 | 26.445 |
| 1377 | 27.445 |
| 1378 | 28.445 |
| 1379 | 29.445 |
| 1380 | 27.385 |
| 1381 | 24.835 |
| 1382 | 25.835 |
| 1383 | 26.835 |
| 1384 | 27.835 |
| 1385 | 28.835 |
| 1386 | 29.835 |
| 1387 | 30.835 |
| 1388 | 31.835 |
| 1389 | 32.835 |
| 1390 | 30.725 |
| 1391 | 31.725 |
| 1392 | 29.715 |
| 1393 | 26.485 |
| 1394 | 27.485 |
| 1395 | 28.485 |
| 1396 | 29.485 |
| 1397 | 30.485 |
| 1398 | 31.485 |
| 1399 | 32.485 |
| 1400 | 33.485 |
| 1401 | 34.485 |
| 1402 | 35.485 |
| 1403 | 32.835 |
| 1404 | 33.835 |
| 1405 | 34.835 |
| 1406 | 35.835 |
| 1407 | 36.835 |
| 1408 | 37.835 |
| 1409 | 35.485 |
| 1410 | 36.485 |
| 1411 | 37.485 |
| 1412 | 35.525 |
| 1413 | 36.525 |
| 1414 | 37.525 |
| 1415 | 35.175 |
| 1416 | 31.645 |
| 1417 | 32.645 |
| 1418 | 29.995 |
| 1419 | 30.995 |
| 1420 | 28.545 |
| 1421 | 29.545 |
| 1422 | 30.545 |
| 1423 | 31.545 |
| 1424 | 32.545 |
| 1425 | 28.825 |
| 1426 | 26.865 |
| 1427 | 27.865 |
| 1428 | 28.865 |
| 1429 | 25.825 |
| 1430 | 26.825 |
| 1431 | 24.815 |
| 1432 | 21.385 |
| 1433 | 18.155 |
| 1434 | 19.155 |
| 1435 | 15.725 |
| 1436 | 16.725 |
| 1437 | 17.725 |
| 1438 | 18.725 |
| 1439 | 19.725 |
| 1440 | 20.725 |
| 1441 | 21.725 |
| 1442 | 19.425 |
| 1443 | 20.425 |
| 1444 | 21.425 |
| 1445 | 22.425 |
| 1446 | 19.875 |
| 1447 | 17.135 |
| 1448 | 18.135 |
| 1449 | 19.135 |
| 1450 | 20.135 |
| 1451 | 21.135 |
| 1452 | 22.135 |
| 1453 | 23.135 |
| 1454 | 24.135 |
| 1455 | 25.135 |
| 1456 | 26.135 |
| 1457 | 27.135 |
| 1458 | 28.135 |
| 1459 | 24.415 |
| 1460 | 25.415 |
| 1461 | 21.595 |
| 1462 | 22.595 |
| 1463 | 23.595 |
| 1464 | 24.595 |
| 1465 | 25.595 |
| 1466 | 26.595 |
| 1467 | 27.595 |
| 1468 | 28.595 |
| 1469 | 29.595 |
| 1470 | 27.485 |
| 1471 | 28.485 |
| 1472 | 29.485 |
| 1473 | 30.485 |
| 1474 | 28.425 |
| 1475 | 29.425 |
| 1476 | 30.425 |
| 1477 | 31.425 |
| 1478 | 32.425 |
| 1479 | 33.425 |
| 1480 | 34.425 |
| 1481 | 35.425 |
| 1482 | 36.425 |
| 1483 | 34.265 |
| 1484 | 35.265 |
| 1485 | 32.765 |
| 1486 | 33.765 |
| 1487 | 34.765 |
| 1488 | 35.765 |
| 1489 | 36.765 |
| 1490 | 37.765 |
| 1491 | 38.765 |
| 1492 | 39.765 |
| 1493 | 37.755 |
| 1494 | 38.755 |
| 1495 | 39.755 |
| 1496 | 40.755 |
| 1497 | 41.755 |
| 1498 | 42.755 |
| 1499 | 43.755 |
| 1500 | 44.755 |
| 1501 | 42.695 |
| 1502 | 43.695 |
| 1503 | 41.245 |
| 1504 | 42.245 |
| 1505 | 40.085 |
| 1506 | 41.085 |
| 1507 | 38.925 |
| 1508 | 39.925 |
| 1509 | 40.925 |
| 1510 | 41.925 |
| 1511 | 42.925 |
| 1512 | 43.925 |
| 1513 | 39.415 |
| 1514 | 36.815 |
| 1515 | 37.815 |
| 1516 | 35.855 |
| 1517 | 36.855 |
| 1518 | 33.625 |
| 1519 | 31.025 |
| 1520 | 32.025 |
| 1521 | 33.025 |
| 1522 | 34.025 |
| 1523 | 35.025 |
| 1524 | 36.025 |
| 1525 | 37.025 |
| 1526 | 38.025 |
| 1527 | 39.025 |
| 1528 | 40.025 |
| 1529 | 41.025 |
| 1530 | 42.025 |
| 1531 | 39.865 |
| 1532 | 40.865 |
| 1533 | 41.865 |
| 1534 | 42.865 |
| 1535 | 43.865 |
| 1536 | 41.565 |
| 1537 | 42.565 |
| 1538 | 43.565 |
| 1539 | 44.565 |
| 1540 | 42.065 |
| 1541 | 43.065 |
| 1542 | 40.465 |
| 1543 | 38.265 |
| 1544 | 35.765 |
| 1545 | 36.765 |
| 1546 | 37.765 |
| 1547 | 38.765 |
| 1548 | 39.765 |
| 1549 | 37.165 |
| 1550 | 38.165 |
| 1551 | 39.165 |
| 1552 | 40.165 |
| 1553 | 41.165 |
| 1554 | 38.025 |
| 1555 | 35.575 |
| 1556 | 31.655 |
| 1557 | 32.655 |
| 1558 | 33.655 |
| 1559 | 34.655 |
| 1560 | 31.615 |
| 1561 | 32.615 |
| 1562 | 30.365 |
| 1563 | 31.365 |
| 1564 | 32.365 |
| 1565 | 33.365 |
| 1566 | 34.365 |
| 1567 | 35.365 |
| 1568 | 32.865 |
| 1569 | 33.865 |
| 1570 | 34.865 |
| 1571 | 32.665 |
| 1572 | 33.665 |
| 1573 | 34.665 |
| 1574 | 35.665 |
| 1575 | 36.665 |
| 1576 | 37.665 |
| 1577 | 38.665 |
| 1578 | 39.665 |
| 1579 | 40.665 |
| 1580 | 41.665 |
| 1581 | 42.665 |
| 1582 | 43.665 |
| 1583 | 41.115 |
| 1584 | 42.115 |
| 1585 | 38.585 |
| 1586 | 39.585 |
| 1587 | 40.585 |
| 1588 | 37.155 |
| 1589 | 38.155 |
| 1590 | 39.155 |
| 1591 | 40.155 |
| 1592 | 41.155 |
| 1593 | 42.155 |
| 1594 | 43.155 |
| 1595 | 40.995 |
| 1596 | 41.995 |
| 1597 | 38.665 |
| 1598 | 39.665 |
| 1599 | 35.255 |
| 1600 | 36.255 |
| 1601 | 32.435 |
| 1602 | 33.435 |
| 1603 | 30.985 |
| 1604 | 31.985 |
| 1605 | 27.965 |
| 1606 | 28.965 |
| 1607 | 29.965 |
| 1608 | 30.965 |
| 1609 | 26.265 |
| 1610 | 22.735 |
| 1611 | 23.735 |
| 1612 | 24.735 |
| 1613 | 25.735 |
| 1614 | 26.735 |
| 1615 | 27.735 |
| 1616 | 28.735 |
| 1617 | 29.735 |
| 1618 | 24.835 |
| 1619 | 25.835 |
| 1620 | 23.775 |
| 1621 | 24.775 |
| 1622 | 25.775 |
| 1623 | 26.775 |
| 1624 | 27.775 |
| 1625 | 25.225 |
| 1626 | 26.225 |
| 1627 | 27.225 |
| 1628 | 28.225 |
| 1629 | 29.225 |
| 1630 | 30.225 |
| 1631 | 31.225 |
| 1632 | 32.225 |
| 1633 | 30.065 |
| 1634 | 31.065 |
| 1635 | 32.065 |
| 1636 | 33.065 |
| 1637 | 34.065 |
| 1638 | 35.065 |
| 1639 | 36.065 |
| 1640 | 33.275 |
| 1641 | 34.275 |
| 1642 | 35.275 |
| 1643 | 36.275 |
| 1644 | 37.275 |
| 1645 | 34.725 |
| 1646 | 35.725 |
| 1647 | 36.725 |
| 1648 | 37.725 |
| 1649 | 38.725 |
| 1650 | 39.725 |
| 1651 | 40.725 |
| 1652 | 41.725 |
| 1653 | 42.725 |
| 1654 | 43.725 |
| 1655 | 44.725 |
| 1656 | 45.725 |
| 1657 | 43.125 |
| 1658 | 40.185 |
| 1659 | 41.185 |
| 1660 | 42.185 |
| 1661 | 39.985 |
| 1662 | 40.985 |
| 1663 | 41.985 |
| 1664 | 40.025 |
| 1665 | 41.025 |
| 1666 | 42.025 |
| 1667 | 43.025 |
| 1668 | 44.025 |
| 1669 | 45.025 |
| 1670 | 41.495 |
| 1671 | 39.195 |
| 1672 | 40.195 |
| 1673 | 41.195 |
| 1674 | 42.195 |
| 1675 | 43.195 |
| 1676 | 44.195 |
| 1677 | 45.195 |
| 1678 | 46.195 |
| 1679 | 47.195 |
| 1680 | 48.195 |
| 1681 | 44.565 |
| 1682 | 45.565 |
| 1683 | 46.565 |
| 1684 | 43.525 |
| 1685 | 44.525 |
| 1686 | 45.525 |
| 1687 | 42.835 |
| 1688 | 43.835 |
| 1689 | 44.835 |
| 1690 | 45.835 |
| 1691 | 46.835 |
| 1692 | 47.835 |
| 1693 | 45.825 |
| 1694 | 46.825 |
| 1695 | 44.525 |
| 1696 | 45.525 |
| 1697 | 46.525 |
| 1698 | 47.525 |
| 1699 | 48.525 |
| 1700 | 45.095 |
| 1701 | 46.095 |
| 1702 | 47.095 |
| 1703 | 48.095 |
| 1704 | 49.095 |
| 1705 | 45.865 |
| 1706 | 46.865 |
| 1707 | 47.865 |
| 1708 | 48.865 |
| 1709 | 49.865 |
| 1710 | 47.465 |
| 1711 | 48.465 |
| 1712 | 45.965 |
| 1713 | 43.075 |
| 1714 | 44.075 |
| 1715 | 45.075 |
| 1716 | 46.075 |
| 1717 | 47.075 |
| 1718 | 48.075 |
| 1719 | 49.075 |
| 1720 | 50.075 |
| 1721 | 51.075 |
| 1722 | 52.075 |
| 1723 | 53.075 |
| 1724 | 49.845 |
| 1725 | 50.845 |
| 1726 | 51.845 |
| 1727 | 48.315 |
| 1728 | 45.175 |
| 1729 | 46.175 |
| 1730 | 47.175 |
| 1731 | 44.525 |
| 1732 | 45.525 |
| 1733 | 46.525 |
| 1734 | 47.525 |
| 1735 | 45.025 |
| 1736 | 46.025 |
| 1737 | 47.025 |
| 1738 | 44.725 |
| 1739 | 41.005 |
| 1740 | 42.005 |
| 1741 | 43.005 |
| 1742 | 44.005 |
| 1743 | 40.865 |
| 1744 | 41.865 |
| 1745 | 42.865 |
| 1746 | 43.865 |
| 1747 | 44.865 |
| 1748 | 42.705 |
| 1749 | 43.705 |
| 1750 | 44.705 |
| 1751 | 45.705 |
| 1752 | 46.705 |
| 1753 | 43.765 |
| 1754 | 44.765 |
| 1755 | 45.765 |
| 1756 | 42.435 |
| 1757 | 39.005 |
| 1758 | 40.005 |
| 1759 | 41.005 |
| 1760 | 38.065 |
| 1761 | 33.655 |
| 1762 | 30.515 |
| 1763 | 31.515 |
| 1764 | 32.515 |
| 1765 | 30.265 |
| 1766 | 31.265 |
| 1767 | 32.265 |
| 1768 | 29.375 |
| 1769 | 30.375 |
| 1770 | 31.375 |
| 1771 | 27.455 |
| 1772 | 28.455 |
| 1773 | 25.225 |
| 1774 | 26.225 |
| 1775 | 27.225 |
| 1776 | 24.335 |
| 1777 | 25.335 |
| 1778 | 26.335 |
| 1779 | 27.335 |
| 1780 | 28.335 |
| 1781 | 29.335 |
| 1782 | 30.335 |
| 1783 | 31.335 |
| 1784 | 28.935 |
| 1785 | 29.935 |
| 1786 | 30.935 |
| 1787 | 28.635 |
| 1788 | 29.635 |
| 1789 | 30.635 |
| 1790 | 25.735 |
| 1791 | 23.285 |
| 1792 | 24.285 |
| 1793 | 25.285 |
| 1794 | 26.285 |
| 1795 | 27.285 |
| 1796 | 28.285 |
| 1797 | 29.285 |
| 1798 | 30.285 |
| 1799 | 27.545 |
| 1800 | 24.945 |
| 1801 | 25.945 |
| 1802 | 26.945 |
| 1803 | 24.005 |
| 1804 | 25.005 |
| 1805 | 26.005 |
| 1806 | 27.005 |
| 1807 | 24.215 |
| 1808 | 21.375 |
| 1809 | 18.875 |
| 1810 | 16.185 |
| 1811 | 14.225 |
| 1812 | 15.225 |
| 1813 | 16.225 |
| 1814 | 17.225 |
| 1815 | 18.225 |
| 1816 | 19.225 |
| 1817 | 20.225 |
| 1818 | 17.085 |
| 1819 | 18.085 |
| 1820 | 19.085 |
| 1821 | 20.085 |
| 1822 | 21.085 |
| 1823 | 22.085 |
| 1824 | 23.085 |
| 1825 | 24.085 |
| 1826 | 25.085 |
| 1827 | 26.085 |
| 1828 | 27.085 |
| 1829 | 28.085 |
| 1830 | 29.085 |
| 1831 | 27.025 |
| 1832 | 28.025 |
| 1833 | 29.025 |
| 1834 | 30.025 |
| 1835 | 31.025 |
| 1836 | 32.025 |
| 1837 | 33.025 |
| 1838 | 34.025 |
| 1839 | 35.025 |
| 1840 | 36.025 |
| 1841 | 33.865 |
| 1842 | 34.865 |
| 1843 | 35.865 |
| 1844 | 33.565 |
| 1845 | 34.565 |
| 1846 | 35.565 |
| 1847 | 36.565 |
| 1848 | 37.565 |
| 1849 | 38.565 |
| 1850 | 39.565 |
| 1851 | 37.265 |
| 1852 | 38.265 |
| 1853 | 35.965 |
| 1854 | 32.435 |
| 1855 | 33.435 |
| 1856 | 34.435 |
| 1857 | 31.745 |
| 1858 | 32.745 |
| 1859 | 33.745 |
| 1860 | 34.745 |
| 1861 | 35.745 |
| 1862 | 36.745 |
| 1863 | 37.745 |
| 1864 | 38.745 |
| 1865 | 39.745 |
| 1866 | 40.745 |
| 1867 | 37.415 |
| 1868 | 38.415 |
| 1869 | 39.415 |
| 1870 | 40.415 |
| 1871 | 41.415 |
| 1872 | 38.185 |
| 1873 | 35.145 |
| 1874 | 36.145 |
| 1875 | 37.145 |
| 1876 | 38.145 |
| 1877 | 39.145 |
| 1878 | 40.145 |
| 1879 | 41.145 |
| 1880 | 42.145 |
| 1881 | 43.145 |
| 1882 | 40.895 |
| 1883 | 41.895 |
| 1884 | 39.105 |
| 1885 | 35.875 |
| 1886 | 36.875 |
| 1887 | 37.875 |
| 1888 | 38.875 |
| 1889 | 39.875 |
| 1890 | 40.875 |
| 1891 | 38.575 |
| 1892 | 39.575 |
| 1893 | 40.575 |
| 1894 | 41.575 |
| 1895 | 42.575 |
| 1896 | 43.575 |
| 1897 | 44.575 |
| 1898 | 45.575 |
| 1899 | 46.575 |
| 1900 | 47.575 |
| 1901 | 48.575 |
| 1902 | 49.575 |
| 1903 | 50.575 |
| 1904 | 45.875 |
| 1905 | 46.875 |
| 1906 | 44.525 |
| 1907 | 45.525 |
| 1908 | 42.195 |
| 1909 | 38.865 |
| 1910 | 36.805 |
| 1911 | 33.375 |
| 1912 | 34.375 |
| 1913 | 31.925 |
| 1914 | 29.675 |
| 1915 | 27.275 |
| 1916 | 28.275 |
| 1917 | 26.215 |
| 1918 | 27.215 |
| 1919 | 28.215 |
| 1920 | 29.215 |
| 1921 | 30.215 |
| 1922 | 31.215 |
| 1923 | 28.565 |
| 1924 | 29.565 |
| 1925 | 30.565 |
| 1926 | 31.565 |
| 1927 | 32.565 |
| 1928 | 33.565 |
| 1929 | 34.565 |
| 1930 | 35.565 |
| 1931 | 33.315 |
| 1932 | 34.315 |
| 1933 | 35.315 |
| 1934 | 36.315 |
| 1935 | 37.315 |
| 1936 | 38.315 |
| 1937 | 39.315 |
| 1938 | 40.315 |
| 1939 | 36.985 |
| 1940 | 37.985 |
| 1941 | 34.455 |
| 1942 | 35.455 |
| 1943 | 36.455 |
| 1944 | 37.455 |
| 1945 | 35.155 |
| 1946 | 36.155 |
| 1947 | 37.155 |
| 1948 | 38.155 |
| 1949 | 39.155 |
| 1950 | 36.505 |
| 1951 | 37.505 |
| 1952 | 38.505 |
| 1953 | 39.505 |
| 1954 | 40.505 |
| 1955 | 41.505 |
| 1956 | 42.505 |
| 1957 | 43.505 |
| 1958 | 39.095 |
| 1959 | 40.095 |
| 1960 | 41.095 |
| 1961 | 38.895 |
| 1962 | 39.895 |
| 1963 | 40.895 |
| 1964 | 41.895 |
| 1965 | 37.385 |
| 1966 | 38.385 |
| 1967 | 39.385 |
| 1968 | 40.385 |
| 1969 | 38.185 |
| 1970 | 39.185 |
| 1971 | 40.185 |
| 1972 | 41.185 |
| 1973 | 42.185 |
| 1974 | 43.185 |
| 1975 | 40.685 |
| 1976 | 41.685 |
| 1977 | 42.685 |
| 1978 | 39.055 |
| 1979 | 40.055 |
| 1980 | 41.055 |
| 1981 | 42.055 |
| 1982 | 43.055 |
| 1983 | 44.055 |
| 1984 | 45.055 |
| 1985 | 46.055 |
| 1986 | 47.055 |
| 1987 | 48.055 |
| 1988 | 49.055 |
| 1989 | 50.055 |
| 1990 | 51.055 |
| 1991 | 49.095 |
| 1992 | 50.095 |
| 1993 | 51.095 |
| 1994 | 52.095 |
| 1995 | 53.095 |
| 1996 | 54.095 |
| 1997 | 51.695 |
| 1998 | 49.735 |
| 1999 | 47.535 |
| 2000 | 48.535 |
| 2001 | 49.535 |
| 2002 | 50.535 |
| 2003 | 48.375 |
| 2004 | 45.925 |
| 2005 | 46.925 |
| 2006 | 43.985 |
| 2007 | 41.385 |
| 2008 | 39.225 |
| 2009 | 40.225 |
| 2010 | 41.225 |
| 2011 | 39.065 |
| 2012 | 36.375 |
| 2013 | 37.375 |
| 2014 | 38.375 |
| 2015 | 39.375 |
| 2016 | 40.375 |
| 2017 | 41.375 |
| 2018 | 37.845 |